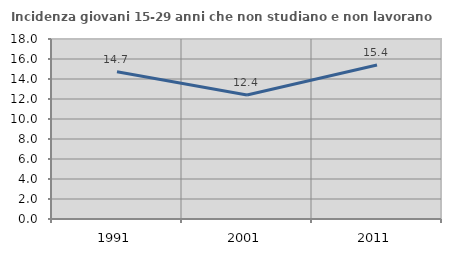
| Category | Incidenza giovani 15-29 anni che non studiano e non lavorano  |
|---|---|
| 1991.0 | 14.727 |
| 2001.0 | 12.401 |
| 2011.0 | 15.408 |